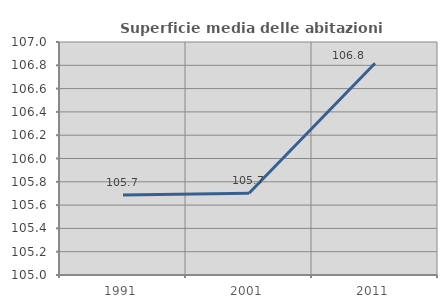
| Category | Superficie media delle abitazioni occupate |
|---|---|
| 1991.0 | 105.686 |
| 2001.0 | 105.701 |
| 2011.0 | 106.817 |